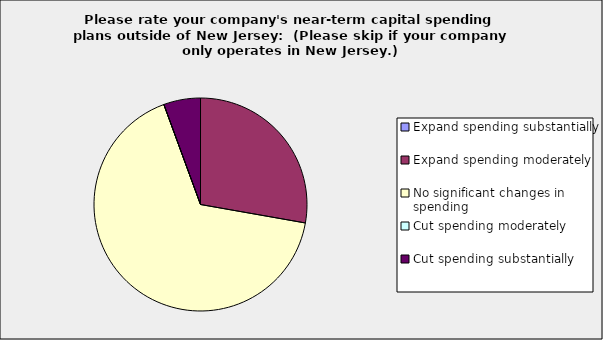
| Category | Series 0 |
|---|---|
| Expand spending substantially | 0 |
| Expand spending moderately | 0.278 |
| No significant changes in spending | 0.667 |
| Cut spending moderately | 0 |
| Cut spending substantially | 0.056 |